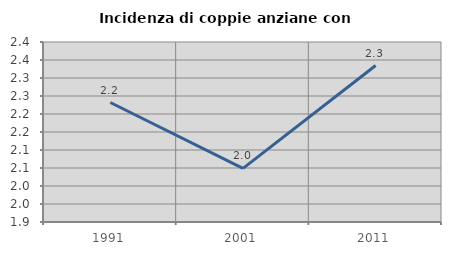
| Category | Incidenza di coppie anziane con figli |
|---|---|
| 1991.0 | 2.232 |
| 2001.0 | 2.049 |
| 2011.0 | 2.335 |